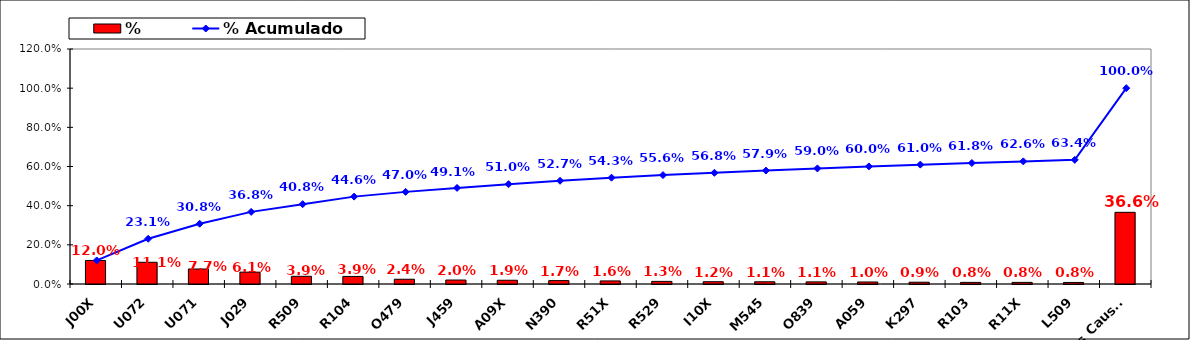
| Category | % |
|---|---|
| J00X | 0.12 |
| U072 | 0.111 |
| U071 | 0.077 |
| J029 | 0.061 |
| R509 | 0.039 |
| R104 | 0.039 |
| O479 | 0.024 |
| J459 | 0.02 |
| A09X | 0.019 |
| N390 | 0.017 |
| R51X | 0.016 |
| R529 | 0.013 |
| I10X | 0.012 |
| M545 | 0.011 |
| O839 | 0.011 |
| A059 | 0.01 |
| K297 | 0.009 |
| R103 | 0.008 |
| R11X | 0.008 |
| L509 | 0.008 |
| Otras Causas | 0.366 |